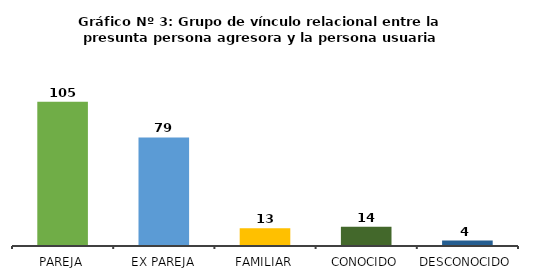
| Category | Series 0 |
|---|---|
| Pareja | 105 |
| Ex pareja | 79 |
| Familiar | 13 |
| Conocido | 14 |
| Desconocido | 4 |